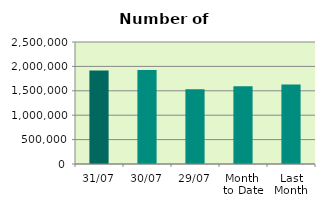
| Category | Series 0 |
|---|---|
| 31/07 | 1913900 |
| 30/07 | 1925638 |
| 29/07 | 1534290 |
| Month 
to Date | 1591495.826 |
| Last
Month | 1630183.4 |